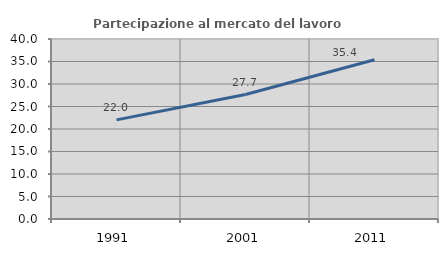
| Category | Partecipazione al mercato del lavoro  femminile |
|---|---|
| 1991.0 | 22.029 |
| 2001.0 | 27.657 |
| 2011.0 | 35.381 |